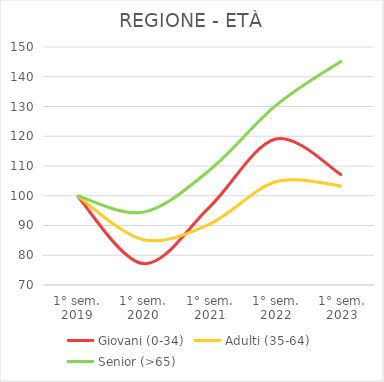
| Category | Giovani (0-34) | Adulti (35-64) | Senior (>65) |
|---|---|---|---|
| 1° sem.
2019 | 100 | 100 | 100 |
| 1° sem.
2020 | 77.194 | 85.233 | 94.492 |
| 1° sem.
2021 | 96.207 | 90.459 | 108.581 |
| 1° sem.
2022 | 119.098 | 104.698 | 130.297 |
| 1° sem.
2023 | 106.894 | 103.233 | 145.392 |